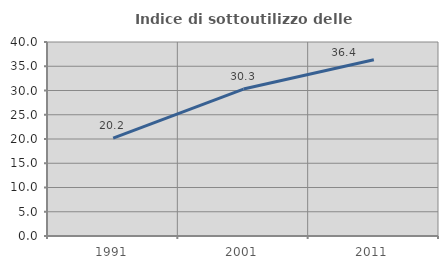
| Category | Indice di sottoutilizzo delle abitazioni  |
|---|---|
| 1991.0 | 20.198 |
| 2001.0 | 30.296 |
| 2011.0 | 36.353 |